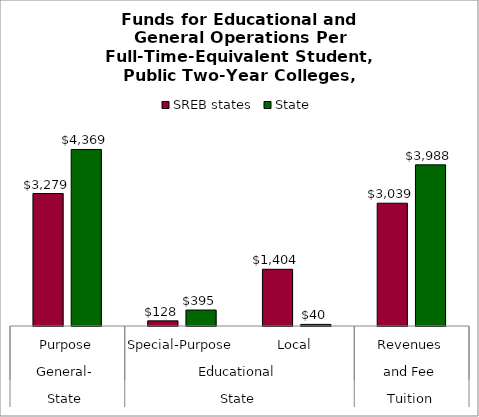
| Category | SREB states | State |
|---|---|---|
| 0 | 3278.748 | 4369.383 |
| 1 | 127.5 | 395.123 |
| 2 | 1403.724 | 39.538 |
| 3 | 3039.387 | 3988.374 |